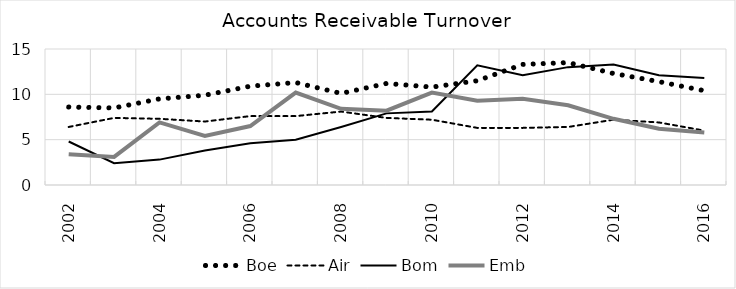
| Category | Boe | Air | Bom | Emb |
|---|---|---|---|---|
| 2002.0 | 8.6 | 6.4 | 4.8 | 3.4 |
| 2003.0 | 8.5 | 7.4 | 2.4 | 3.1 |
| 2004.0 | 9.5 | 7.3 | 2.8 | 6.9 |
| 2005.0 | 9.9 | 7 | 3.8 | 5.4 |
| 2006.0 | 10.9 | 7.6 | 4.6 | 6.5 |
| 2007.0 | 11.3 | 7.6 | 5 | 10.2 |
| 2008.0 | 10.1 | 8.1 | 6.4 | 8.4 |
| 2009.0 | 11.2 | 7.4 | 7.9 | 8.2 |
| 2010.0 | 10.8 | 7.2 | 8.1 | 10.2 |
| 2011.0 | 11.5 | 6.3 | 13.2 | 9.3 |
| 2012.0 | 13.3 | 6.3 | 12.1 | 9.5 |
| 2013.0 | 13.5 | 6.4 | 13 | 8.8 |
| 2014.0 | 12.3 | 7.2 | 13.3 | 7.3 |
| 2015.0 | 11.4 | 6.9 | 12.1 | 6.2 |
| 2016.0 | 10.4 | 6 | 11.8 | 5.8 |